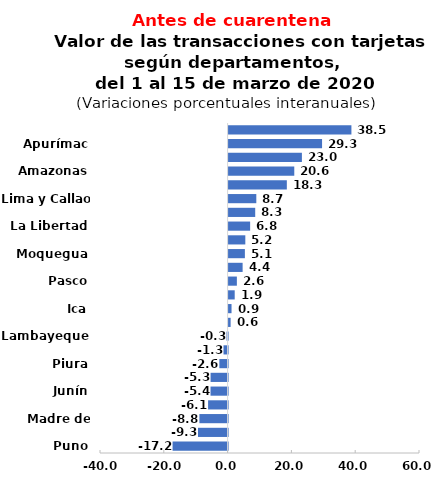
| Category | Var.% |
|---|---|
| Puno | -17.248 |
| Loreto | -9.284 |
| Madre de Dios | -8.841 |
| Cusco | -6.116 |
| Junín | -5.356 |
| Cajamarca | -5.336 |
| Piura | -2.588 |
| Huánuco | -1.28 |
| Lambayeque | -0.338 |
| Tacna | 0.631 |
| Ica | 0.919 |
| Arequipa | 1.914 |
| Pasco | 2.591 |
| Ucayali | 4.395 |
| Moquegua | 5.105 |
| Áncash | 5.242 |
| La Libertad | 6.753 |
| San Martín | 8.344 |
| Lima y Callao | 8.688 |
| Tumbes | 18.255 |
| Amazonas | 20.59 |
| Ayacucho | 22.977 |
| Apurímac | 29.3 |
| Huancavelica | 38.5 |